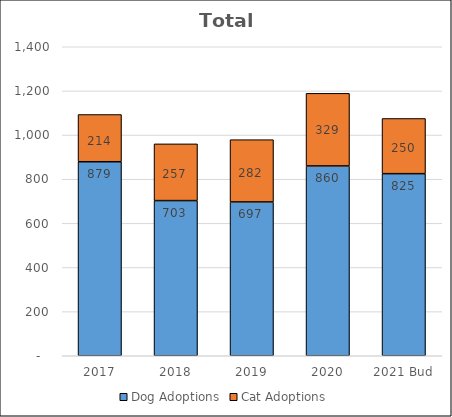
| Category | Dog Adoptions | Cat Adoptions |
|---|---|---|
| 2017 | 879 | 214 |
| 2018 | 703 | 257 |
| 2019 | 697 | 282 |
| 2020 | 860 | 329 |
| 2021 Bud | 825 | 250 |